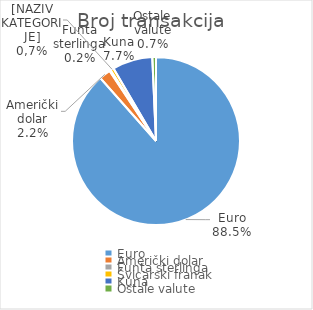
| Category | Broj transakcija  |
|---|---|
| Euro | 7155661 |
| Američki dolar | 179391 |
| Funta sterlinga | 18912 |
| Švicarski franak | 51834 |
| Kuna | 624449 |
| Ostale valute | 57182 |